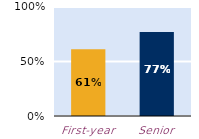
| Category | frequently |
|---|---|
| First-year | 0.613 |
| Senior | 0.771 |